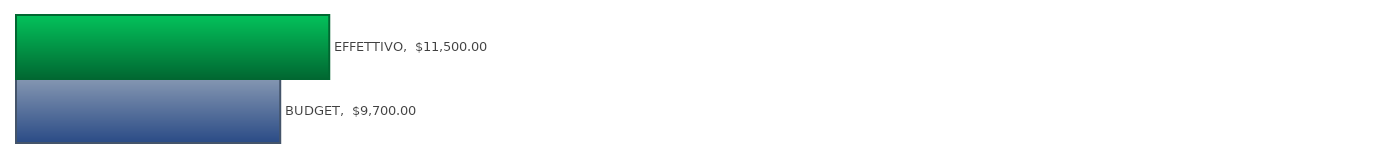
| Category | Series 0 |
|---|---|
| BUDGET | 9700 |
| EFFETTIVO | 11500 |